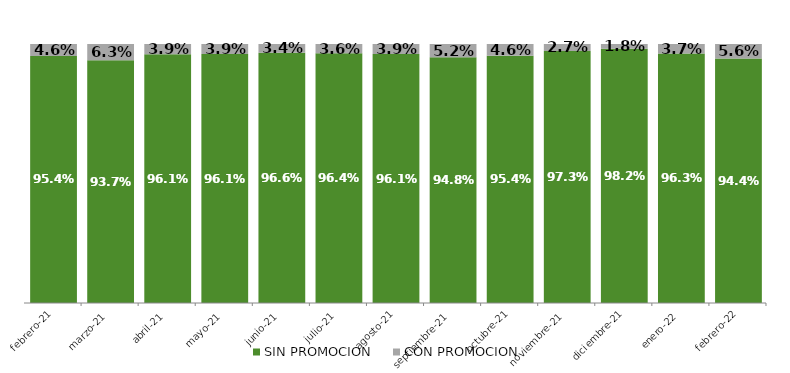
| Category | SIN PROMOCION   | CON PROMOCION   |
|---|---|---|
| 2021-02-01 | 0.954 | 0.046 |
| 2021-03-01 | 0.937 | 0.063 |
| 2021-04-01 | 0.961 | 0.039 |
| 2021-05-01 | 0.961 | 0.039 |
| 2021-06-01 | 0.966 | 0.034 |
| 2021-07-01 | 0.964 | 0.036 |
| 2021-08-01 | 0.961 | 0.039 |
| 2021-09-01 | 0.948 | 0.052 |
| 2021-10-01 | 0.954 | 0.046 |
| 2021-11-01 | 0.973 | 0.027 |
| 2021-12-01 | 0.982 | 0.018 |
| 2022-01-01 | 0.963 | 0.037 |
| 2022-02-01 | 0.944 | 0.056 |